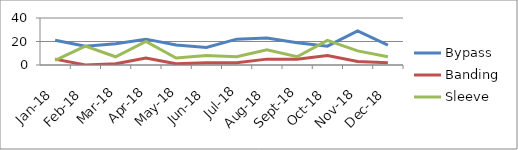
| Category | Bypass | Banding | Sleeve |
|---|---|---|---|
| 2018-01-01 | 21 | 5 | 4 |
| 2018-02-01 | 16 | 0 | 16 |
| 2018-03-01 | 18 | 1 | 7 |
| 2018-04-01 | 22 | 6 | 20 |
| 2018-05-01 | 17 | 1 | 6 |
| 2018-06-01 | 15 | 2 | 8 |
| 2018-07-01 | 22 | 2 | 7 |
| 2018-08-01 | 23 | 5 | 13 |
| 2018-09-01 | 19 | 5 | 7 |
| 2018-10-01 | 16 | 8 | 21 |
| 2018-11-01 | 29 | 3 | 12 |
| 2018-12-01 | 17 | 2 | 7 |